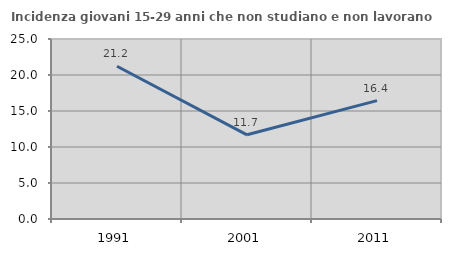
| Category | Incidenza giovani 15-29 anni che non studiano e non lavorano  |
|---|---|
| 1991.0 | 21.221 |
| 2001.0 | 11.694 |
| 2011.0 | 16.435 |